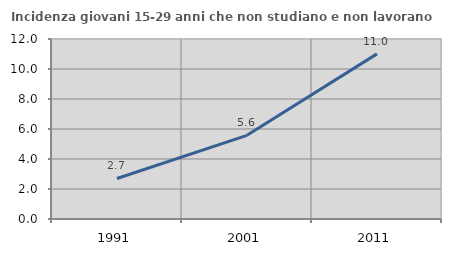
| Category | Incidenza giovani 15-29 anni che non studiano e non lavorano  |
|---|---|
| 1991.0 | 2.703 |
| 2001.0 | 5.578 |
| 2011.0 | 11.008 |